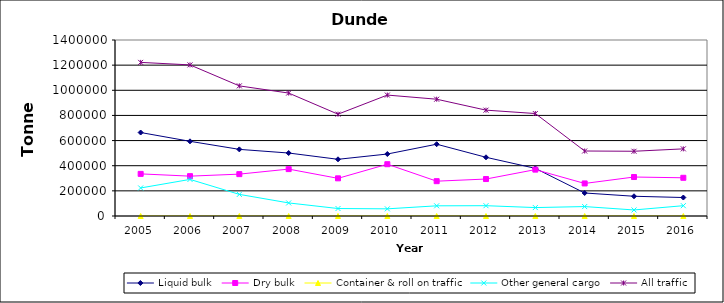
| Category | Liquid bulk | Dry bulk | Container & roll on traffic | Other general cargo | All traffic |
|---|---|---|---|---|---|
| 2005.0 | 664000 | 335000 | 0 | 223000 | 1222000 |
| 2006.0 | 594000 | 317000 | 0 | 291000 | 1202000 |
| 2007.0 | 530000 | 333000 | 0 | 172000 | 1035000 |
| 2008.0 | 501000 | 373000 | 0 | 104000 | 978000 |
| 2009.0 | 450942 | 299559 | 0 | 59441 | 809942 |
| 2010.0 | 493000 | 412000 | 0 | 57000 | 962000 |
| 2011.0 | 571000 | 277000 | 0 | 81000 | 929000 |
| 2012.0 | 467000 | 294000 | 0 | 82000 | 842000 |
| 2013.0 | 379000 | 369000 | 0 | 67000 | 815000 |
| 2014.0 | 183000 | 259000 | 0 | 75000 | 517000 |
| 2015.0 | 157000 | 310000 | 0 | 48000 | 515000 |
| 2016.0 | 147000 | 304000 | 0 | 82000 | 534000 |